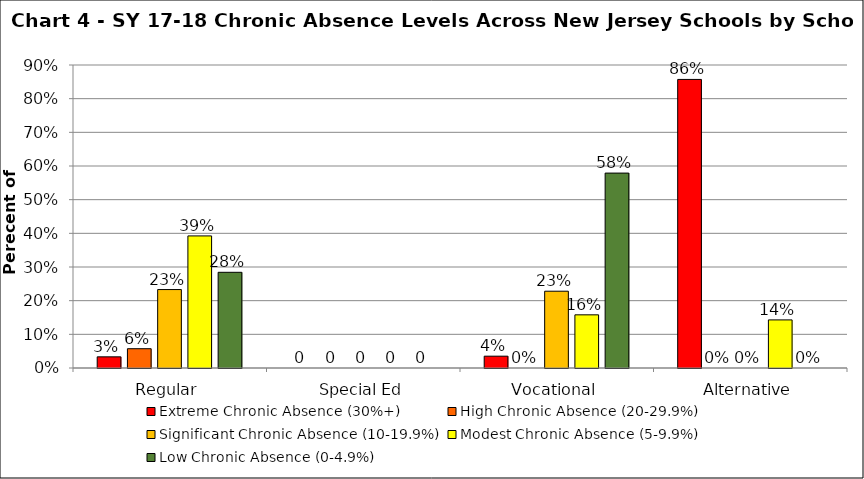
| Category | Extreme Chronic Absence (30%+) | High Chronic Absence (20-29.9%) | Significant Chronic Absence (10-19.9%) | Modest Chronic Absence (5-9.9%) | Low Chronic Absence (0-4.9%) |
|---|---|---|---|---|---|
| 0 | 0.033 | 0.057 | 0.233 | 0.392 | 0.284 |
| 1 | 0 | 0 | 0 | 0 | 0 |
| 2 | 0.035 | 0 | 0.228 | 0.158 | 0.579 |
| 3 | 0.857 | 0 | 0 | 0.143 | 0 |